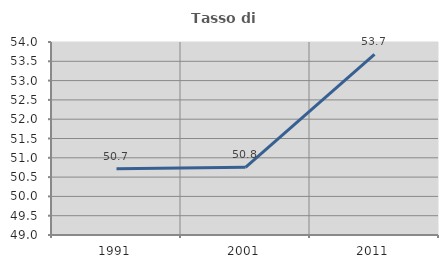
| Category | Tasso di occupazione   |
|---|---|
| 1991.0 | 50.716 |
| 2001.0 | 50.755 |
| 2011.0 | 53.677 |